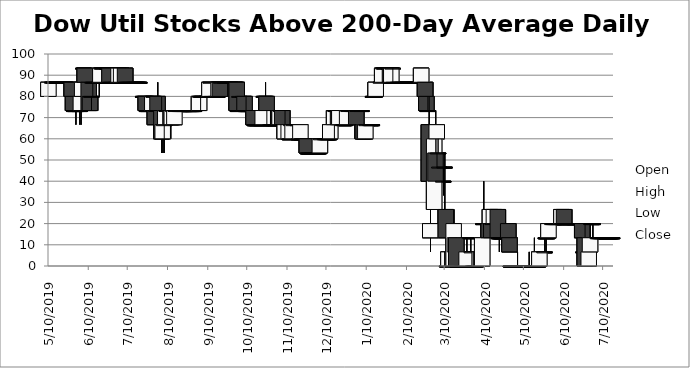
| Category | Open | High | Low | Close |
|---|---|---|---|---|
| 5/10/19 | 80 | 86.66 | 80 | 86.66 |
| 5/13/19 | 86.66 | 86.66 | 86.66 | 86.66 |
| 5/14/19 | 86.66 | 86.66 | 86.66 | 86.66 |
| 5/15/19 | 86.66 | 86.66 | 86.66 | 86.66 |
| 5/16/19 | 86.66 | 86.66 | 86.66 | 86.66 |
| 5/17/19 | 86.66 | 86.66 | 86.66 | 86.66 |
| 5/20/19 | 86.66 | 86.66 | 86.66 | 86.66 |
| 5/21/19 | 86.66 | 86.66 | 86.66 | 86.66 |
| 5/22/19 | 86.66 | 86.66 | 86.66 | 86.66 |
| 5/23/19 | 86.66 | 86.66 | 86.66 | 86.66 |
| 5/24/19 | 86.66 | 86.66 | 86.66 | 86.66 |
| 5/28/19 | 86.66 | 86.66 | 80 | 80 |
| 5/29/19 | 80 | 80 | 73.33 | 73.33 |
| 5/30/19 | 73.33 | 80 | 73.33 | 73.33 |
| 5/31/19 | 73.33 | 73.33 | 66.66 | 73.33 |
| 6/3/19 | 73.33 | 73.33 | 66.66 | 73.33 |
| 6/4/19 | 73.33 | 80 | 66.66 | 80 |
| 6/5/19 | 80 | 93.33 | 80 | 86.66 |
| 6/6/19 | 93.33 | 93.33 | 93.33 | 93.33 |
| 6/7/19 | 93.33 | 93.33 | 86.66 | 86.66 |
| 6/10/19 | 86.66 | 86.66 | 73.33 | 73.33 |
| 6/11/19 | 80 | 80 | 73.33 | 73.33 |
| 6/12/19 | 80 | 80 | 73.33 | 80 |
| 6/13/19 | 86.66 | 86.66 | 80 | 86.66 |
| 6/14/19 | 86.66 | 86.66 | 86.66 | 86.66 |
| 6/17/19 | 86.66 | 86.66 | 86.66 | 86.66 |
| 6/18/19 | 86.66 | 86.66 | 80 | 86.66 |
| 6/19/19 | 86.66 | 93.33 | 86.66 | 93.33 |
| 6/20/19 | 93.33 | 93.33 | 86.66 | 93.33 |
| 6/21/19 | 93.33 | 93.33 | 93.33 | 93.33 |
| 6/24/19 | 93.33 | 93.33 | 93.33 | 93.33 |
| 6/25/19 | 93.33 | 93.33 | 93.33 | 93.33 |
| 6/26/19 | 93.33 | 93.33 | 86.66 | 86.66 |
| 6/27/19 | 86.66 | 86.66 | 86.66 | 86.66 |
| 6/28/19 | 86.66 | 86.66 | 86.66 | 86.66 |
| 7/1/19 | 86.66 | 86.66 | 86.66 | 86.66 |
| 7/2/19 | 86.66 | 86.66 | 86.66 | 86.66 |
| 7/3/19 | 86.66 | 93.33 | 86.66 | 93.33 |
| 7/5/19 | 86.66 | 93.33 | 86.66 | 93.33 |
| 7/8/19 | 93.33 | 93.33 | 86.66 | 86.66 |
| 7/9/19 | 86.66 | 86.66 | 86.66 | 86.66 |
| 7/10/19 | 86.66 | 86.66 | 86.66 | 86.66 |
| 7/11/19 | 86.66 | 86.66 | 86.66 | 86.66 |
| 7/12/19 | 86.66 | 86.66 | 86.66 | 86.66 |
| 7/15/19 | 86.66 | 86.66 | 86.66 | 86.66 |
| 7/16/19 | 86.66 | 86.66 | 86.66 | 86.66 |
| 7/17/19 | 86.66 | 86.66 | 86.66 | 86.66 |
| 7/18/19 | 86.66 | 86.66 | 86.66 | 86.66 |
| 7/19/19 | 86.66 | 86.66 | 86.66 | 86.66 |
| 7/22/19 | 80 | 80 | 80 | 80 |
| 7/23/19 | 80 | 80 | 80 | 80 |
| 7/24/19 | 80 | 80 | 73.33 | 73.33 |
| 7/25/19 | 73.33 | 73.33 | 73.33 | 73.33 |
| 7/26/19 | 73.33 | 73.33 | 73.33 | 73.33 |
| 7/29/19 | 73.33 | 80 | 73.33 | 80 |
| 7/30/19 | 80 | 80 | 73.33 | 80 |
| 7/31/19 | 73.33 | 73.33 | 66.66 | 66.66 |
| 8/1/19 | 73.33 | 80 | 66.66 | 73.33 |
| 8/2/19 | 80 | 86.66 | 66.66 | 73.33 |
| 8/5/19 | 73.33 | 80 | 53.33 | 60 |
| 8/6/19 | 60 | 66.66 | 53.33 | 66.66 |
| 8/7/19 | 66.66 | 73.33 | 53.33 | 66.66 |
| 8/8/19 | 66.66 | 73.33 | 66.66 | 73.33 |
| 8/9/19 | 73.33 | 73.33 | 73.33 | 73.33 |
| 8/12/19 | 73.33 | 73.33 | 60 | 66.66 |
| 8/13/19 | 66.66 | 73.33 | 66.66 | 73.33 |
| 8/14/19 | 73.33 | 73.33 | 73.33 | 73.33 |
| 8/15/19 | 66.66 | 73.33 | 66.66 | 73.33 |
| 8/16/19 | 73.33 | 73.33 | 73.33 | 73.33 |
| 8/19/19 | 73.33 | 73.33 | 73.33 | 73.33 |
| 8/20/19 | 73.33 | 73.33 | 73.33 | 73.33 |
| 8/21/19 | 73.33 | 73.33 | 73.33 | 73.33 |
| 8/22/19 | 73.33 | 73.33 | 73.33 | 73.33 |
| 8/23/19 | 73.33 | 73.33 | 73.33 | 73.33 |
| 8/26/19 | 73.33 | 73.33 | 73.33 | 73.33 |
| 8/27/19 | 73.33 | 73.33 | 73.33 | 73.33 |
| 8/28/19 | 73.33 | 73.33 | 73.33 | 73.33 |
| 8/29/19 | 73.33 | 73.33 | 73.33 | 73.33 |
| 8/30/19 | 73.33 | 73.33 | 73.33 | 73.33 |
| 9/3/19 | 73.33 | 80 | 73.33 | 80 |
| 9/4/19 | 80 | 80 | 73.33 | 80 |
| 9/5/19 | 80 | 80 | 80 | 80 |
| 9/6/19 | 80 | 80 | 80 | 80 |
| 9/9/19 | 80 | 80 | 80 | 80 |
| 9/10/19 | 80 | 80 | 80 | 80 |
| 9/11/19 | 80 | 86.66 | 80 | 86.66 |
| 9/12/19 | 86.66 | 86.66 | 86.66 | 86.66 |
| 9/13/19 | 80 | 80 | 80 | 80 |
| 9/16/19 | 80 | 80 | 80 | 80 |
| 9/17/19 | 80 | 80 | 80 | 80 |
| 9/18/19 | 80 | 86.66 | 80 | 86.66 |
| 9/19/19 | 86.66 | 86.66 | 80 | 80 |
| 9/20/19 | 86.66 | 86.66 | 86.66 | 86.66 |
| 9/23/19 | 86.66 | 86.66 | 86.66 | 86.66 |
| 9/24/19 | 86.66 | 86.66 | 86.66 | 86.66 |
| 9/25/19 | 86.66 | 86.66 | 86.66 | 86.66 |
| 9/26/19 | 86.66 | 86.66 | 86.66 | 86.66 |
| 9/27/19 | 86.66 | 86.66 | 86.66 | 86.66 |
| 9/30/19 | 86.66 | 86.66 | 86.66 | 86.66 |
| 10/1/19 | 86.66 | 86.66 | 80 | 86.66 |
| 10/2/19 | 86.66 | 86.66 | 73.33 | 73.33 |
| 10/3/19 | 73.33 | 73.33 | 73.33 | 73.33 |
| 10/4/19 | 80 | 80 | 73.33 | 80 |
| 10/7/19 | 80 | 80 | 80 | 80 |
| 10/8/19 | 80 | 80 | 73.33 | 73.33 |
| 10/9/19 | 73.33 | 80 | 73.33 | 73.33 |
| 10/10/19 | 73.33 | 73.33 | 73.33 | 73.33 |
| 10/11/19 | 73.33 | 73.33 | 73.33 | 73.33 |
| 10/14/19 | 73.33 | 73.33 | 73.33 | 73.33 |
| 10/15/19 | 73.33 | 73.33 | 66.66 | 66.66 |
| 10/16/19 | 66.66 | 66.66 | 66.66 | 66.66 |
| 10/17/19 | 66.66 | 66.66 | 66.66 | 66.66 |
| 10/18/19 | 66.66 | 66.66 | 66.66 | 66.66 |
| 10/21/19 | 66.66 | 66.66 | 66.66 | 66.66 |
| 10/22/19 | 66.66 | 80 | 66.66 | 73.33 |
| 10/23/19 | 80 | 80 | 73.33 | 80 |
| 10/24/19 | 80 | 86.66 | 80 | 80 |
| 10/25/19 | 80 | 80 | 66.66 | 73.33 |
| 10/28/19 | 66.66 | 73.33 | 66.66 | 66.66 |
| 10/29/19 | 66.66 | 73.33 | 66.66 | 66.66 |
| 10/30/19 | 66.66 | 66.66 | 66.66 | 66.66 |
| 10/31/19 | 66.66 | 66.66 | 66.66 | 66.66 |
| 11/1/19 | 66.66 | 66.66 | 66.66 | 66.66 |
| 11/4/19 | 66.66 | 73.33 | 66.66 | 73.33 |
| 11/5/19 | 73.33 | 73.33 | 73.33 | 73.33 |
| 11/6/19 | 73.33 | 73.33 | 66.66 | 66.66 |
| 11/7/19 | 66.66 | 66.66 | 60 | 66.66 |
| 11/8/19 | 60 | 73.33 | 60 | 66.66 |
| 11/11/19 | 60 | 66.66 | 60 | 66.66 |
| 11/12/19 | 60 | 60 | 60 | 60 |
| 11/13/19 | 66.66 | 66.66 | 60 | 66.66 |
| 11/14/19 | 60 | 66.66 | 60 | 66.66 |
| 11/15/19 | 66.66 | 66.66 | 66.66 | 66.66 |
| 11/18/19 | 66.66 | 66.66 | 66.66 | 66.66 |
| 11/19/19 | 60 | 66.66 | 60 | 60 |
| 11/20/19 | 60 | 66.66 | 60 | 66.66 |
| 11/21/19 | 60 | 60 | 60 | 60 |
| 11/22/19 | 60 | 60 | 60 | 60 |
| 11/25/19 | 60 | 60 | 53.33 | 53.33 |
| 11/26/19 | 53.33 | 53.33 | 53.33 | 53.33 |
| 11/27/19 | 53.33 | 53.33 | 53.33 | 53.33 |
| 11/29/19 | 53.33 | 53.33 | 53.33 | 53.33 |
| 12/2/19 | 53.33 | 53.33 | 53.33 | 53.33 |
| 12/3/19 | 53.33 | 53.33 | 53.33 | 53.33 |
| 12/4/19 | 53.33 | 53.33 | 53.33 | 53.33 |
| 12/5/19 | 53.33 | 60 | 53.33 | 60 |
| 12/6/19 | 60 | 60 | 60 | 60 |
| 12/9/19 | 60 | 60 | 60 | 60 |
| 12/10/19 | 60 | 60 | 60 | 60 |
| 12/11/19 | 60 | 60 | 60 | 60 |
| 12/12/19 | 60 | 66.66 | 60 | 60 |
| 12/13/19 | 60 | 73.33 | 60 | 66.66 |
| 12/16/19 | 66.66 | 73.33 | 60 | 73.33 |
| 12/17/19 | 73.33 | 73.33 | 73.33 | 73.33 |
| 12/18/19 | 73.33 | 73.33 | 73.33 | 73.33 |
| 12/19/19 | 73.33 | 73.33 | 66.66 | 66.66 |
| 12/20/19 | 66.66 | 73.33 | 66.66 | 73.33 |
| 12/23/19 | 66.66 | 73.33 | 66.66 | 66.66 |
| 12/24/19 | 66.66 | 73.33 | 66.66 | 66.66 |
| 12/26/19 | 66.66 | 73.33 | 66.66 | 73.33 |
| 12/27/19 | 73.33 | 73.33 | 73.33 | 73.33 |
| 12/30/19 | 73.33 | 73.33 | 73.33 | 73.33 |
| 12/31/19 | 73.33 | 73.33 | 73.33 | 73.33 |
| 1/2/20 | 73.33 | 73.33 | 66.66 | 66.66 |
| 1/3/20 | 73.33 | 73.33 | 73.33 | 73.33 |
| 1/6/20 | 73.33 | 73.33 | 73.33 | 73.33 |
| 1/7/20 | 66.66 | 66.66 | 60 | 60 |
| 1/8/20 | 60 | 66.66 | 60 | 66.66 |
| 1/9/20 | 60 | 66.66 | 60 | 66.66 |
| 1/10/20 | 66.66 | 66.66 | 66.66 | 66.66 |
| 1/13/20 | 66.66 | 66.66 | 66.66 | 66.66 |
| 1/14/20 | 66.66 | 66.66 | 66.66 | 66.66 |
| 1/15/20 | 80 | 80 | 80 | 80 |
| 1/16/20 | 80 | 80 | 80 | 80 |
| 1/17/20 | 80 | 86.66 | 80 | 86.66 |
| 1/21/20 | 86.66 | 86.66 | 86.66 | 86.66 |
| 1/22/20 | 86.66 | 93.33 | 86.66 | 93.33 |
| 1/23/20 | 93.33 | 93.33 | 93.33 | 93.33 |
| 1/24/20 | 93.33 | 93.33 | 93.33 | 93.33 |
| 1/27/20 | 93.33 | 93.33 | 93.33 | 93.33 |
| 1/28/20 | 93.33 | 93.33 | 86.66 | 86.66 |
| 1/29/20 | 86.66 | 93.33 | 86.66 | 93.33 |
| 1/30/20 | 93.33 | 93.33 | 86.66 | 93.33 |
| 1/31/20 | 86.66 | 86.66 | 86.66 | 86.66 |
| 2/3/20 | 86.66 | 86.66 | 86.66 | 86.66 |
| 2/4/20 | 86.66 | 86.66 | 86.66 | 86.66 |
| 2/5/20 | 86.66 | 86.66 | 86.66 | 86.66 |
| 2/6/20 | 86.66 | 86.66 | 86.66 | 86.66 |
| 2/7/20 | 86.66 | 86.66 | 86.66 | 86.66 |
| 2/10/20 | 86.66 | 86.66 | 86.66 | 86.66 |
| 2/11/20 | 86.66 | 86.66 | 86.66 | 86.66 |
| 2/12/20 | 86.66 | 86.66 | 86.66 | 86.66 |
| 2/13/20 | 86.66 | 86.66 | 86.66 | 86.66 |
| 2/14/20 | 86.66 | 86.66 | 86.66 | 86.66 |
| 2/18/20 | 86.66 | 86.66 | 86.66 | 86.66 |
| 2/19/20 | 86.66 | 86.66 | 86.66 | 86.66 |
| 2/20/20 | 86.66 | 86.66 | 86.66 | 86.66 |
| 2/21/20 | 86.66 | 93.33 | 86.66 | 93.33 |
| 2/24/20 | 86.66 | 86.66 | 80 | 80 |
| 2/25/20 | 80 | 80 | 73.33 | 73.33 |
| 2/26/20 | 73.33 | 80 | 73.33 | 73.33 |
| 2/27/20 | 66.66 | 80 | 40 | 40 |
| 2/28/20 | 13.33 | 26.66 | 6.66 | 20 |
| 3/2/20 | 26.66 | 60 | 26.66 | 60 |
| 3/3/20 | 53.33 | 73.33 | 40 | 40 |
| 3/4/20 | 60 | 66.66 | 46.66 | 66.66 |
| 3/5/20 | 53.33 | 60 | 53.33 | 53.33 |
| 3/6/20 | 46.66 | 46.66 | 46.66 | 46.66 |
| 3/9/20 | 40 | 46.66 | 33.33 | 40 |
| 3/10/20 | 46.66 | 53.33 | 13.33 | 46.66 |
| 3/11/20 | 26.66 | 26.66 | 13.33 | 13.33 |
| 3/12/20 | 0.01 | 6.66 | 0.01 | 0.01 |
| 3/13/20 | 0.01 | 6.66 | 0.01 | 6.66 |
| 3/16/20 | 6.66 | 6.66 | 0.01 | 0.01 |
| 3/17/20 | 0.01 | 26.66 | 0.01 | 20 |
| 3/18/20 | 6.66 | 13.33 | 0.01 | 13.33 |
| 3/19/20 | 13.33 | 13.33 | 0.01 | 0.01 |
| 3/20/20 | 0.01 | 0.01 | 0.01 | 0.01 |
| 3/23/20 | 0.01 | 0.01 | 0.01 | 0.01 |
| 3/24/20 | 0.01 | 0.01 | 0.01 | 0.01 |
| 3/25/20 | 0.01 | 0.01 | 0.01 | 0.01 |
| 3/26/20 | 0.01 | 6.66 | 0.01 | 0.01 |
| 3/27/20 | 0.01 | 13.33 | 0.01 | 6.66 |
| 3/30/20 | 13.33 | 13.33 | 6.66 | 13.33 |
| 3/31/20 | 6.66 | 6.66 | 6.66 | 6.66 |
| 4/1/20 | 0.01 | 0.01 | 0.01 | 0.01 |
| 4/2/20 | 0.01 | 0.01 | 0.01 | 0.01 |
| 4/3/20 | 0.01 | 0.01 | 0.01 | 0.01 |
| 4/6/20 | 0.01 | 6.66 | 0.01 | 6.66 |
| 4/7/20 | 6.66 | 13.33 | 0.01 | 0.01 |
| 4/8/20 | 0.01 | 13.33 | 0.01 | 13.33 |
| 4/9/20 | 20 | 40 | 20 | 20 |
| 4/13/20 | 20 | 20 | 13.33 | 13.33 |
| 4/14/20 | 20 | 26.66 | 20 | 26.66 |
| 4/15/20 | 20 | 20 | 13.33 | 13.33 |
| 4/16/20 | 20 | 20 | 13.33 | 20 |
| 4/17/20 | 20 | 26.66 | 13.33 | 26.66 |
| 4/20/20 | 26.66 | 26.66 | 13.33 | 13.33 |
| 4/21/20 | 13.33 | 13.33 | 6.66 | 13.33 |
| 4/22/20 | 13.33 | 13.33 | 13.33 | 13.33 |
| 4/23/20 | 13.33 | 13.33 | 13.33 | 13.33 |
| 4/24/20 | 13.33 | 13.33 | 13.33 | 13.33 |
| 4/27/20 | 13.33 | 13.33 | 13.33 | 13.33 |
| 4/28/20 | 20 | 20 | 13.33 | 13.33 |
| 4/29/20 | 13.33 | 13.33 | 6.66 | 6.66 |
| 4/30/20 | 0.01 | 0.01 | 0.01 | 0.01 |
| 5/1/20 | 0.01 | 0.01 | 0.01 | 0.01 |
| 5/4/20 | 0.01 | 0.01 | 0.01 | 0.01 |
| 5/5/20 | 0.01 | 6.66 | 0.01 | 0.01 |
| 5/6/20 | 0.01 | 0.01 | 0.01 | 0.01 |
| 5/7/20 | 0.01 | 0.01 | 0.01 | 0.01 |
| 5/8/20 | 0.01 | 0.01 | 0.01 | 0.01 |
| 5/11/20 | 0.01 | 0.01 | 0.01 | 0.01 |
| 5/12/20 | 0.01 | 0.01 | 0.01 | 0.01 |
| 5/13/20 | 0.01 | 0.01 | 0.01 | 0.01 |
| 5/14/20 | 0.01 | 6.66 | 0.01 | 0.01 |
| 5/15/20 | 0.01 | 0.01 | 0.01 | 0.01 |
| 5/18/20 | 0.01 | 13.33 | 0.01 | 0.01 |
| 5/19/20 | 0.01 | 0.01 | 0.01 | 0.01 |
| 5/20/20 | 0.01 | 0.01 | 0.01 | 0.01 |
| 5/21/20 | 0.01 | 0.01 | 0.01 | 0.01 |
| 5/22/20 | 0.01 | 6.66 | 0.01 | 6.66 |
| 5/26/20 | 6.66 | 13.33 | 6.66 | 6.66 |
| 5/27/20 | 13.33 | 13.33 | 6.66 | 13.33 |
| 5/28/20 | 13.33 | 13.33 | 13.33 | 13.33 |
| 5/29/20 | 13.33 | 20 | 13.33 | 20 |
| 6/1/20 | 20 | 20 | 20 | 20 |
| 6/2/20 | 20 | 20 | 20 | 20 |
| 6/3/20 | 20 | 20 | 20 | 20 |
| 6/4/20 | 20 | 20 | 20 | 20 |
| 6/5/20 | 20 | 26.66 | 20 | 20 |
| 6/8/20 | 20 | 26.66 | 20 | 26.66 |
| 6/9/20 | 20 | 26.66 | 20 | 20 |
| 6/10/20 | 26.66 | 26.66 | 20 | 20 |
| 6/11/20 | 20 | 20 | 20 | 20 |
| 6/12/20 | 20 | 20 | 20 | 20 |
| 6/15/20 | 20 | 20 | 20 | 20 |
| 6/16/20 | 20 | 20 | 20 | 20 |
| 6/17/20 | 20 | 20 | 20 | 20 |
| 6/18/20 | 20 | 20 | 20 | 20 |
| 6/19/20 | 20 | 20 | 20 | 20 |
| 6/22/20 | 20 | 20 | 20 | 20 |
| 6/23/20 | 20 | 20 | 20 | 20 |
| 6/24/20 | 20 | 20 | 6.66 | 13.33 |
| 6/25/20 | 6.66 | 6.66 | 0.01 | 6.66 |
| 6/26/20 | 13.33 | 20 | 0.01 | 0.01 |
| 6/29/20 | 0.01 | 6.66 | 0.01 | 6.66 |
| 6/30/20 | 6.66 | 20 | 6.66 | 13.33 |
| 7/1/20 | 20 | 20 | 20 | 20 |
| 7/2/20 | 20 | 20 | 13.33 | 20 |
| 7/6/20 | 13.33 | 13.33 | 13.33 | 13.33 |
| 7/7/20 | 13.33 | 13.33 | 13.33 | 13.33 |
| 7/8/20 | 13.33 | 13.33 | 13.33 | 13.33 |
| 7/9/20 | 13.33 | 13.33 | 13.33 | 13.33 |
| 7/10/20 | 13.33 | 13.33 | 13.33 | 13.33 |
| 7/13/20 | 13.33 | 13.33 | 13.33 | 13.33 |
| 7/14/20 | 13.33 | 13.33 | 13.33 | 13.33 |
| 7/15/20 | 13.33 | 13.33 | 13.33 | 13.33 |
| 7/16/20 | 13.33 | 13.33 | 13.33 | 13.33 |
| 7/17/20 | 13.33 | 13.33 | 13.33 | 13.33 |